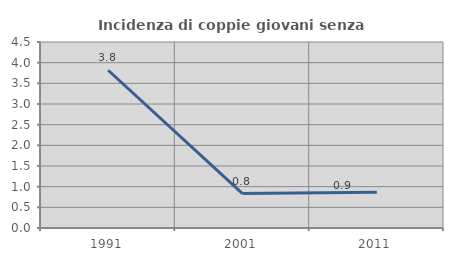
| Category | Incidenza di coppie giovani senza figli |
|---|---|
| 1991.0 | 3.817 |
| 2001.0 | 0.833 |
| 2011.0 | 0.862 |